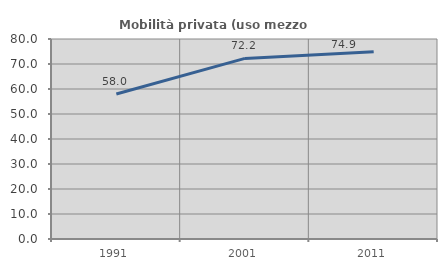
| Category | Mobilità privata (uso mezzo privato) |
|---|---|
| 1991.0 | 58.024 |
| 2001.0 | 72.244 |
| 2011.0 | 74.908 |